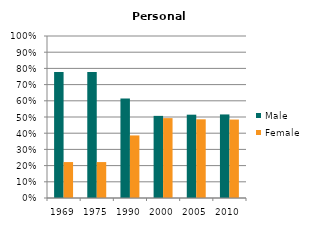
| Category | Male | Female |
|---|---|---|
| 1969.0 | 0.778 | 0.222 |
| 1975.0 | 0.778 | 0.222 |
| 1990.0 | 0.614 | 0.386 |
| 2000.0 | 0.507 | 0.493 |
| 2005.0 | 0.514 | 0.486 |
| 2010.0 | 0.516 | 0.484 |